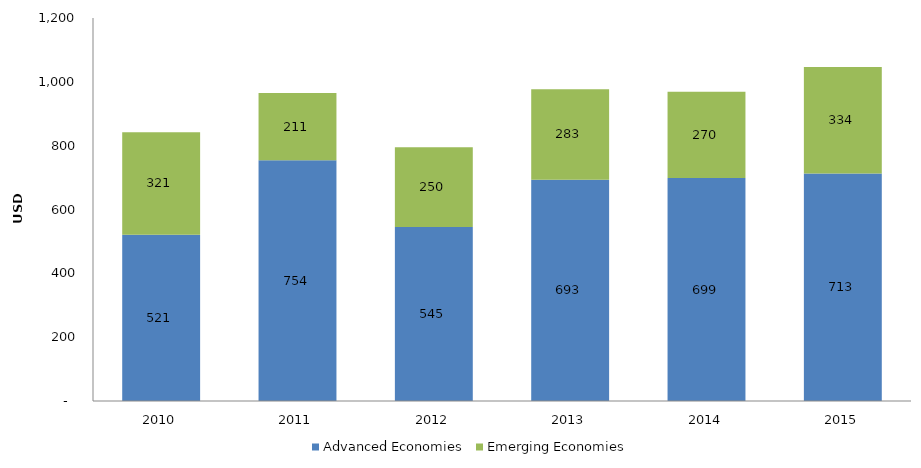
| Category | Advanced Economies | Emerging Economies |
|---|---|---|
| 2010.0 | 521.235 | 321.014 |
| 2011.0 | 754.153 | 210.741 |
| 2012.0 | 545.279 | 249.548 |
| 2013.0 | 693.481 | 283.226 |
| 2014.0 | 698.663 | 270.146 |
| 2015.0 | 713.115 | 333.533 |